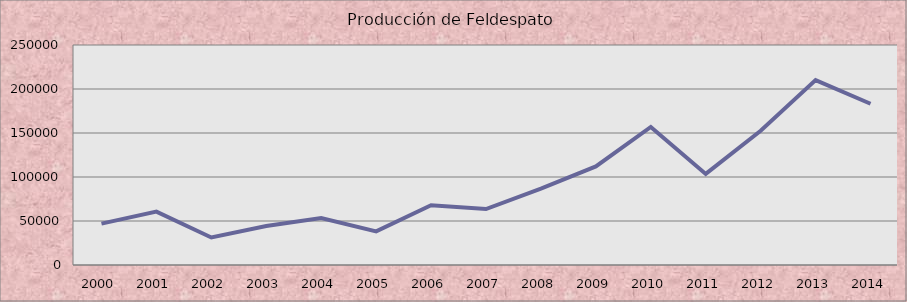
| Category | Series 0 |
|---|---|
| 2000.0 | 47041.35 |
| 2001.0 | 60688.27 |
| 2002.0 | 31254 |
| 2003.0 | 44267.92 |
| 2004.0 | 53469.08 |
| 2005.0 | 38249.69 |
| 2006.0 | 67843.54 |
| 2007.0 | 63557.39 |
| 2008.0 | 86888.86 |
| 2009.0 | 111985.07 |
| 2010.0 | 156888.06 |
| 2011.0 | 103498.36 |
| 2012.0 | 152590.17 |
| 2013.0 | 210142.38 |
| 2014.0 | 183259.13 |